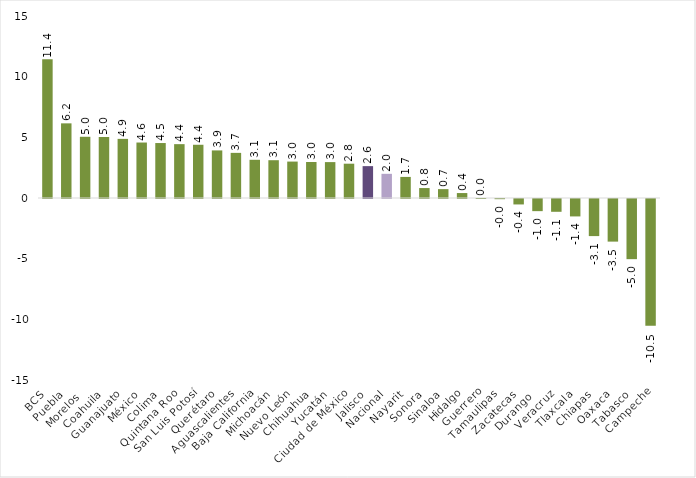
| Category | Series 0 |
|---|---|
| BCS | 11.431 |
| Puebla | 6.152 |
| Morelos  | 5.045 |
| Coahuila | 5.03 |
| Guanajuato | 4.872 |
| México | 4.572 |
| Colima | 4.53 |
| Quintana Roo | 4.438 |
| San Luis Potosí | 4.388 |
| Querétaro | 3.922 |
| Aguascalientes | 3.72 |
| Baja California | 3.149 |
| Michoacán | 3.115 |
| Nuevo León | 3.002 |
| Chihuahua | 2.968 |
| Yucatán | 2.959 |
| Ciudad de México | 2.827 |
| Jalisco | 2.627 |
| Nacional | 1.992 |
| Nayarit  | 1.738 |
| Sonora | 0.82 |
| Sinaloa | 0.732 |
| Hidalgo | 0.408 |
| Guerrero | 0.002 |
| Tamaulipas | -0.015 |
| Zacatecas | -0.449 |
| Durango  | -1.001 |
| Veracruz | -1.055 |
| Tlaxcala | -1.436 |
| Chiapas | -3.057 |
| Oaxaca | -3.512 |
| Tabasco | -4.957 |
| Campeche | -10.451 |